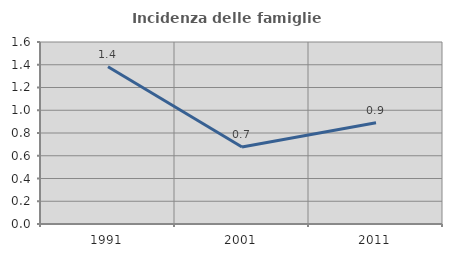
| Category | Incidenza delle famiglie numerose |
|---|---|
| 1991.0 | 1.382 |
| 2001.0 | 0.677 |
| 2011.0 | 0.891 |